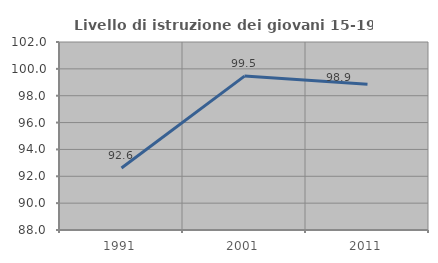
| Category | Livello di istruzione dei giovani 15-19 anni |
|---|---|
| 1991.0 | 92.617 |
| 2001.0 | 99.462 |
| 2011.0 | 98.851 |